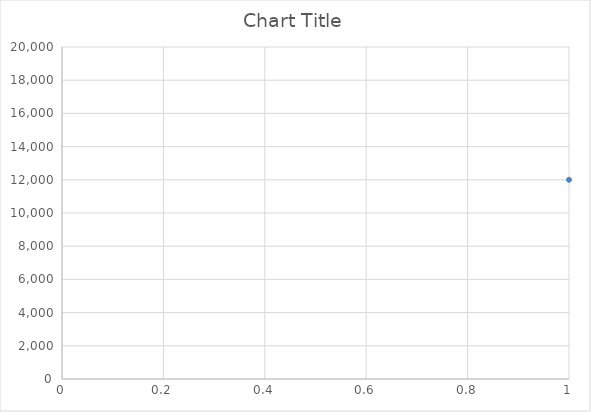
| Category | Series 0 |
|---|---|
| 0 | 12000 |
| 1 | 12000 |
| 2 | 16000 |
| 3 | 12000 |
| 4 | 12000 |
| 5 | 16000 |
| 6 | 16000 |
| 7 | 16000 |
| 8 | 18000 |
| 9 | 18000 |
| 10 | 18000 |
| 11 | 18000 |
| 12 | 12000 |
| 13 | 12000 |
| 14 | 12000 |
| 15 | 14400 |
| 16 | 18295 |
| 17 | 12000 |
| 18 | 13600 |
| 19 | 14400 |
| 20 | 12000 |
| 21 | 12000 |
| 22 | 16000 |